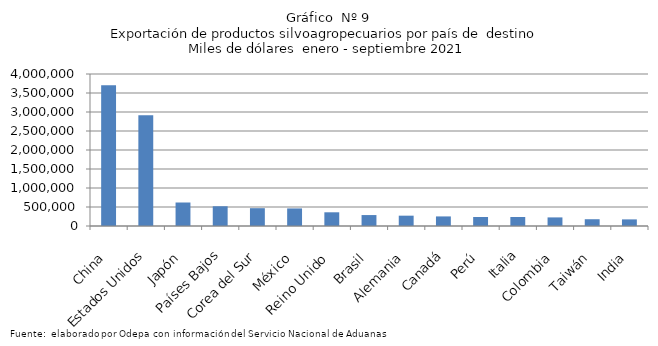
| Category | Series 0 |
|---|---|
| China | 3702436.575 |
| Estados Unidos | 2915903.954 |
| Japón | 618374.978 |
| Países Bajos | 519532.172 |
| Corea del Sur | 468782.273 |
| México | 462173.877 |
| Reino Unido | 360751.938 |
| Brasil | 287910.251 |
| Alemania | 271746.299 |
| Canadá | 252077.475 |
| Perú | 237636.565 |
| Italia | 237204.276 |
| Colombia | 226117.006 |
| Taiwán | 178302.704 |
| India | 173963.509 |